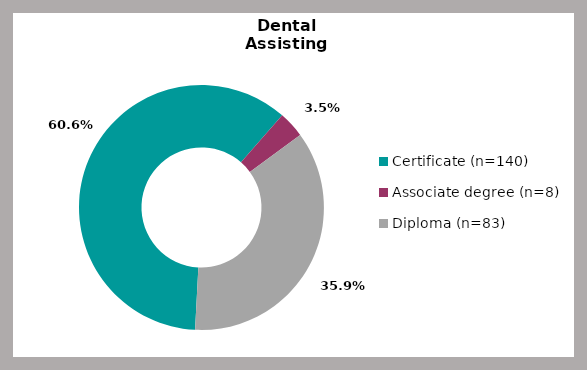
| Category | Series 0 |
|---|---|
| Certificate (n=140) | 0.606 |
| Associate degree (n=8) | 0.035 |
| Diploma (n=83) | 0.359 |